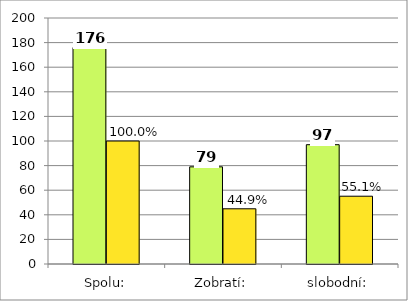
| Category | Series 0 | Series 1 |
|---|---|---|
| Spolu: | 176 | 100 |
| Zobratí: | 79 | 44.886 |
| slobodní: | 97 | 55.114 |